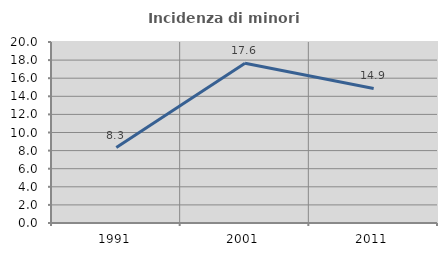
| Category | Incidenza di minori stranieri |
|---|---|
| 1991.0 | 8.333 |
| 2001.0 | 17.647 |
| 2011.0 | 14.865 |